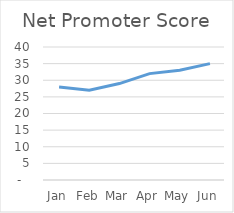
| Category | Net Promoter Score |
|---|---|
| Jan | 28 |
| Feb | 27 |
| Mar | 29 |
| Apr | 32 |
| May | 33 |
| Jun | 35 |